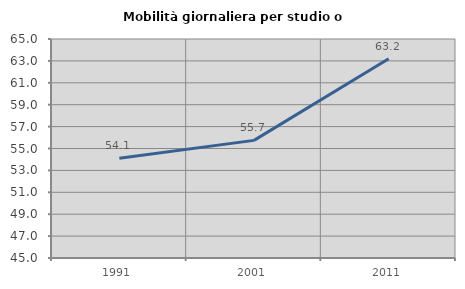
| Category | Mobilità giornaliera per studio o lavoro |
|---|---|
| 1991.0 | 54.113 |
| 2001.0 | 55.742 |
| 2011.0 | 63.188 |